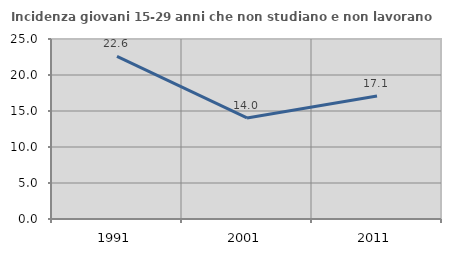
| Category | Incidenza giovani 15-29 anni che non studiano e non lavorano  |
|---|---|
| 1991.0 | 22.586 |
| 2001.0 | 14.031 |
| 2011.0 | 17.096 |